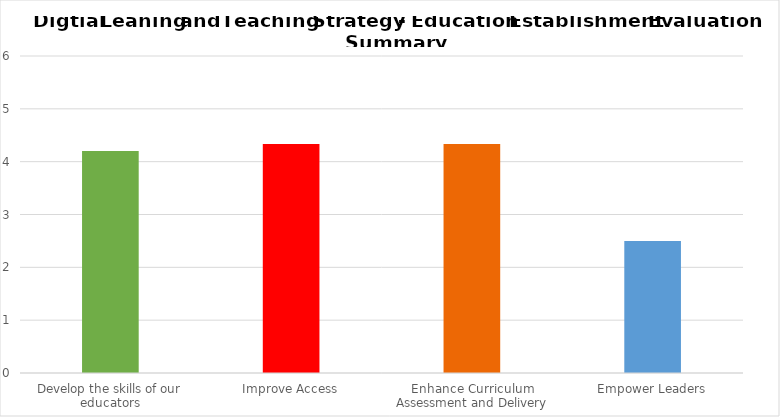
| Category | Series 0 |
|---|---|
| Develop the skills of our educators | 4.2 |
| Improve Access | 4.333 |
| Enhance Curriculum Assessment and Delivery | 4.333 |
| Empower Leaders | 2.5 |